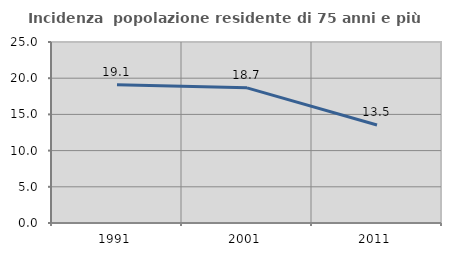
| Category | Incidenza  popolazione residente di 75 anni e più |
|---|---|
| 1991.0 | 19.091 |
| 2001.0 | 18.667 |
| 2011.0 | 13.544 |